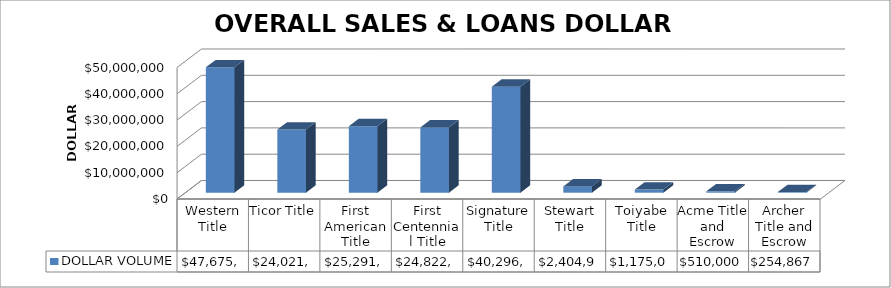
| Category | DOLLAR VOLUME |
|---|---|
| Western Title | 47675821 |
| Ticor Title | 24021083 |
| First American Title | 25291521 |
| First Centennial Title | 24822303 |
| Signature Title | 40296943 |
| Stewart Title | 2404900 |
| Toiyabe Title | 1175000 |
| Acme Title and Escrow | 510000 |
| Archer Title and Escrow | 254867 |